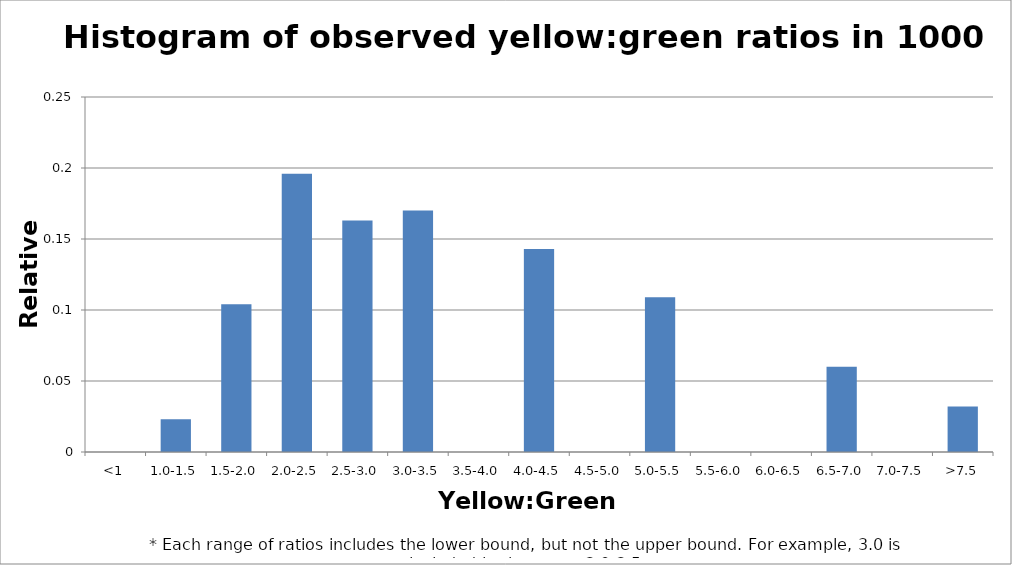
| Category | Series 1 |
|---|---|
| <1 | 0 |
| 1.0-1.5 | 0.023 |
| 1.5-2.0 | 0.104 |
| 2.0-2.5 | 0.196 |
| 2.5-3.0 | 0.163 |
| 3.0-3.5 | 0.17 |
| 3.5-4.0 | 0 |
| 4.0-4.5 | 0.143 |
| 4.5-5.0 | 0 |
| 5.0-5.5 | 0.109 |
| 5.5-6.0 | 0 |
| 6.0-6.5 | 0 |
| 6.5-7.0 | 0.06 |
| 7.0-7.5 | 0 |
| >7.5 | 0.032 |